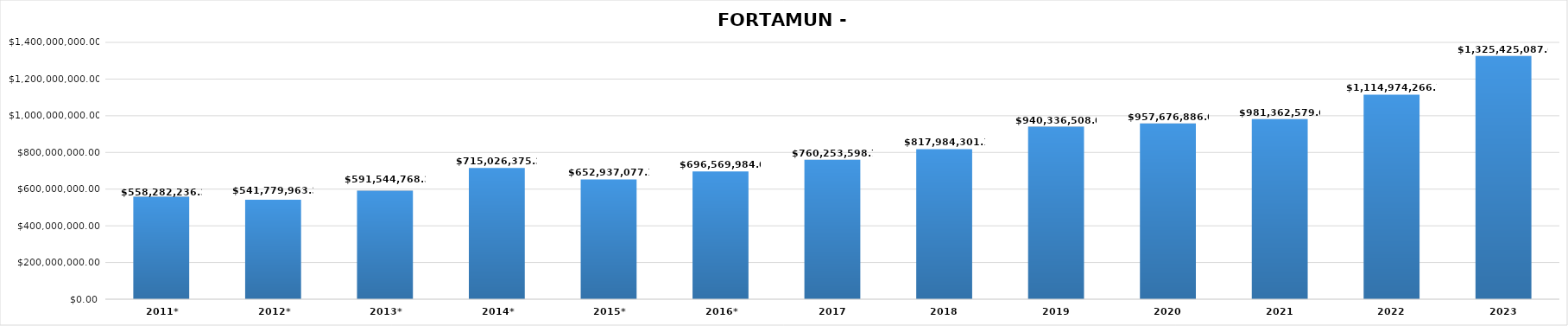
| Category | FORTAMUN - DF |
|---|---|
| 2011* | 558282236.354 |
| 2012* | 541779963.32 |
| 2013* | 591544768.312 |
| 2014* | 715026375.375 |
| 2015* | 652937077.12 |
| 2016* | 696569984 |
| 2017 | 760253598.7 |
| 2018 | 817984301.11 |
| 2019 | 940336508 |
| 2020 | 957676886 |
| 2021 | 981362579.66 |
| 2022 | 1114974266.7 |
| 2023 | 1325425087.68 |